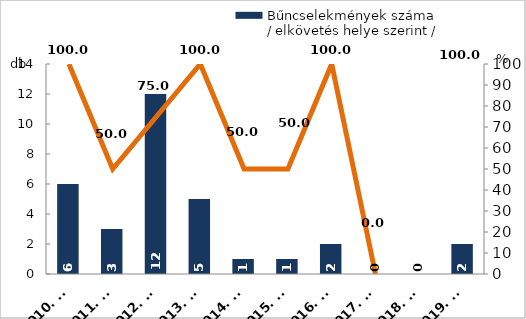
| Category | Bűncselekmények száma
/ elkövetés helye szerint / |
|---|---|
| 2010. év | 6 |
| 2011. év | 3 |
| 2012. év | 12 |
| 2013. év | 5 |
| 2014. év | 1 |
| 2015. év | 1 |
| 2016. év | 2 |
| 2017. év | 0 |
| 2018. év | 0 |
| 2019. év | 2 |